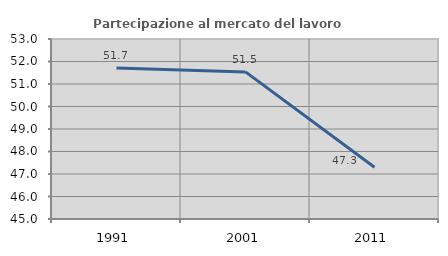
| Category | Partecipazione al mercato del lavoro  femminile |
|---|---|
| 1991.0 | 51.711 |
| 2001.0 | 51.538 |
| 2011.0 | 47.303 |